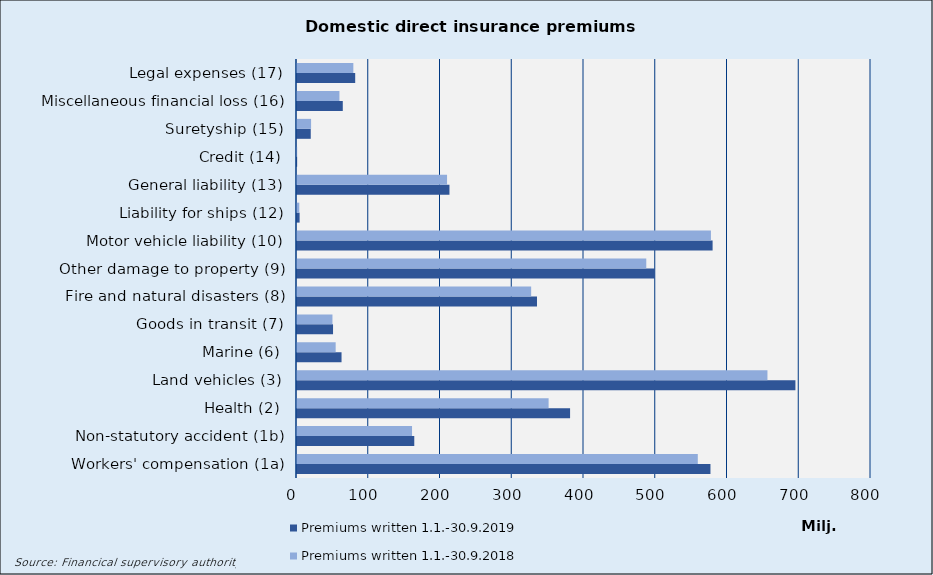
| Category | Premiums written |
|---|---|
| Workers' compensation (1a) | 558601.51 |
| Non-statutory accident (1b) | 160328.9 |
| Health (2) | 350676.629 |
| Land vehicles (3) | 655678.022 |
| Marine (6) | 53892.415 |
| Goods in transit (7) | 49415.574 |
| Fire and natural disasters (8) | 326355.779 |
| Other damage to property (9) | 486800.296 |
| Motor vehicle liability (10) | 576912.132 |
| Liability for ships (12) | 3191.632 |
| General liability (13) | 209136.091 |
| Credit (14) | 203.124 |
| Suretyship (15) | 19627.085 |
| Miscellaneous financial loss (16) | 59141.14 |
| Legal expenses (17) | 78524.75 |